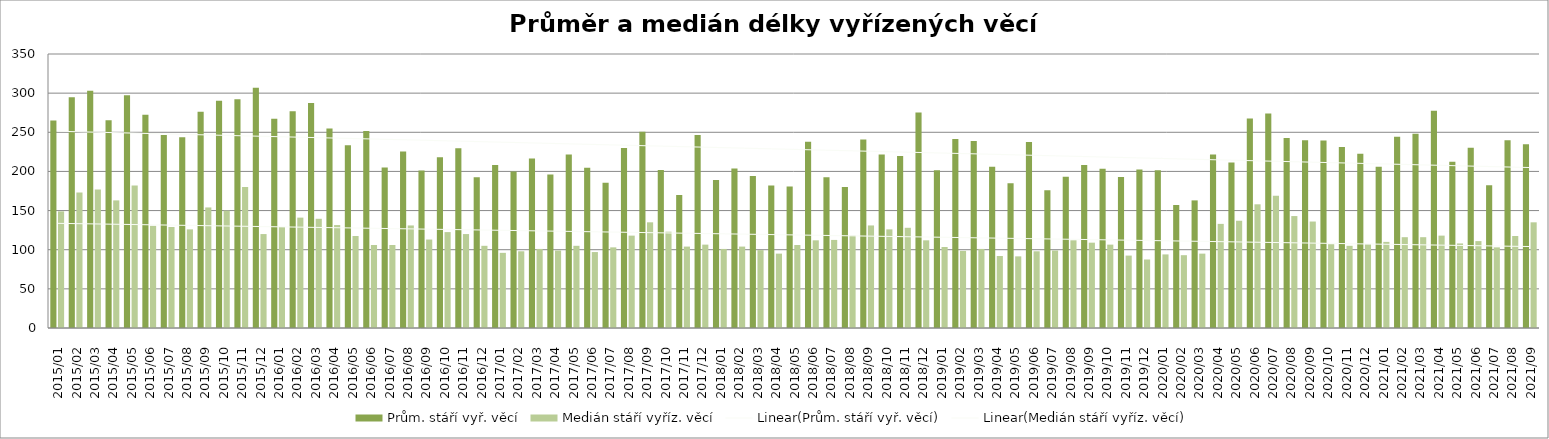
| Category | Prům. stáří vyř. věcí | Medián stáří vyříz. věcí |
|---|---|---|
| 2015/01 | 265.12 | 149 |
| 2015/02 | 294.84 | 173 |
| 2015/03 | 302.94 | 177 |
| 2015/04 | 265.45 | 163 |
| 2015/05 | 297.19 | 182 |
| 2015/06 | 272.26 | 130.5 |
| 2015/07 | 246.63 | 129 |
| 2015/08 | 243.76 | 126 |
| 2015/09 | 276.35 | 154 |
| 2015/10 | 290.23 | 150 |
| 2015/11 | 292.15 | 180 |
| 2015/12 | 306.77 | 120 |
| 2016/01 | 267.35 | 129 |
| 2016/02 | 276.86 | 141 |
| 2016/03 | 287.26 | 139.5 |
| 2016/04 | 254.75 | 131.5 |
| 2016/05 | 233.57 | 117.5 |
| 2016/06 | 251.51 | 106 |
| 2016/07 | 204.89 | 106 |
| 2016/08 | 225.54 | 131 |
| 2016/09 | 201.19 | 113 |
| 2016/10 | 218.13 | 122.5 |
| 2016/11 | 229.61 | 120 |
| 2016/12 | 192.52 | 105 |
| 2017/01 | 208.18 | 96 |
| 2017/02 | 199.93 | 98 |
| 2017/03 | 216.59 | 101 |
| 2017/04 | 196.08 | 99 |
| 2017/05 | 221.61 | 105 |
| 2017/06 | 204.59 | 97 |
| 2017/07 | 185.69 | 103 |
| 2017/08 | 229.92 | 118 |
| 2017/09 | 250.75 | 135 |
| 2017/10 | 201.69 | 123 |
| 2017/11 | 169.76 | 104 |
| 2017/12 | 246.65 | 106.5 |
| 2018/01 | 189.13 | 101 |
| 2018/02 | 203.68 | 104 |
| 2018/03 | 194.29 | 99.5 |
| 2018/04 | 181.89 | 95 |
| 2018/05 | 180.61 | 106 |
| 2018/06 | 237.94 | 112 |
| 2018/07 | 192.6 | 112.5 |
| 2018/08 | 180.03 | 118 |
| 2018/09 | 240.79 | 131 |
| 2018/10 | 221.64 | 126 |
| 2018/11 | 219.58 | 128 |
| 2018/12 | 275.34 | 112 |
| 2019/01 | 201.37 | 103.5 |
| 2019/02 | 241.38 | 98.5 |
| 2019/03 | 238.89 | 101 |
| 2019/04 | 206.1 | 92 |
| 2019/05 | 184.79 | 91.5 |
| 2019/06 | 237.75 | 98 |
| 2019/07 | 175.86 | 99 |
| 2019/08 | 193.36 | 112 |
| 2019/09 | 208.07 | 109 |
| 2019/10 | 203.35 | 106.5 |
| 2019/11 | 192.73 | 92.5 |
| 2019/12 | 202.39 | 87.5 |
| 2020/01 | 201.42 | 94 |
| 2020/02 | 157.1 | 93 |
| 2020/03 | 163.01 | 95 |
| 2020/04 | 221.72 | 133 |
| 2020/05 | 211.5 | 137 |
| 2020/06 | 267.65 | 158 |
| 2020/07 | 274.06 | 169 |
| 2020/08 | 242.55 | 143 |
| 2020/09 | 239.91 | 136 |
| 2020/10 | 239.52 | 107 |
| 2020/11 | 231.35 | 105 |
| 2020/12 | 222.69 | 107 |
| 2021/01 | 206.05 | 110 |
| 2021/02 | 244.24 | 116 |
| 2021/03 | 248.07 | 116 |
| 2021/04 | 277.41 | 118 |
| 2021/05 | 212.38 | 108 |
| 2021/06 | 230.31 | 111 |
| 2021/07 | 182.35 | 103 |
| 2021/08 | 239.86 | 117.5 |
| 2021/09 | 234.81 | 135 |